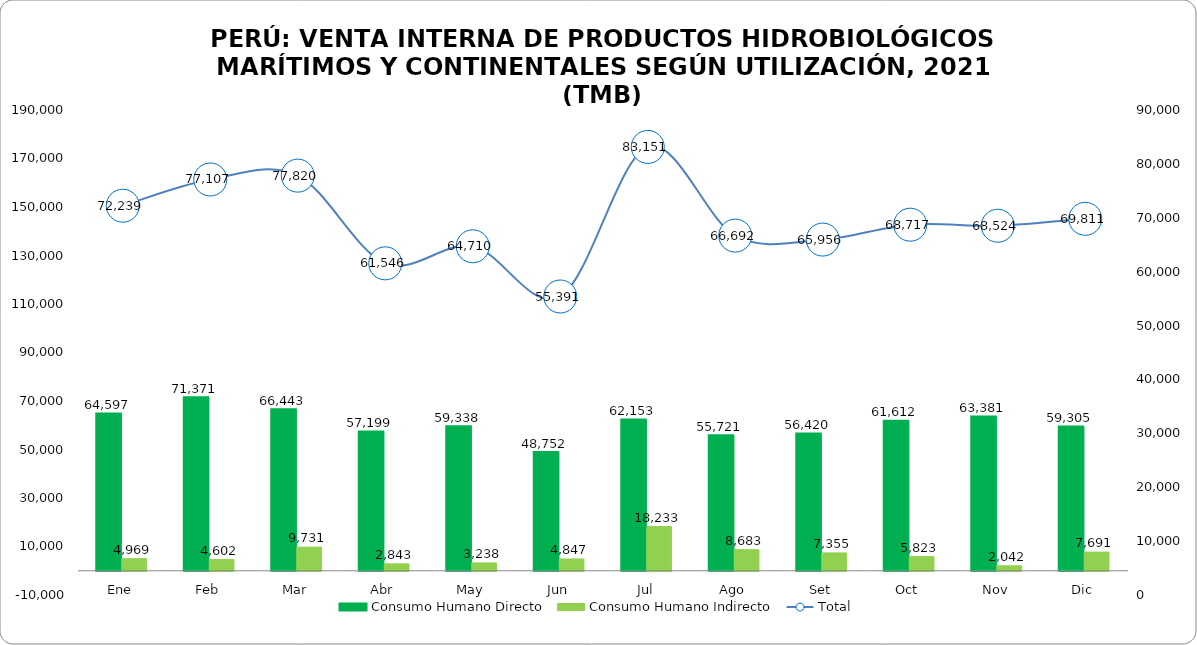
| Category | Consumo Humano Directo | Consumo Humano Indirecto |
|---|---|---|
| Ene | 64597.175 | 4968.551 |
| Feb | 71371.176 | 4602.41 |
| Mar | 66442.531 | 9731.26 |
| Abr    | 57199.277 | 2842.504 |
| May | 59338.219 | 3238.014 |
| Jun | 48752.435 | 4847.384 |
| Jul | 62152.521 | 18233.256 |
| Ago | 55721.146 | 8683.47 |
| Set | 56419.845 | 7354.936 |
| Oct | 61612.482 | 5822.659 |
| Nov | 63380.847 | 2042.484 |
| Dic | 59305.2 | 7690.866 |